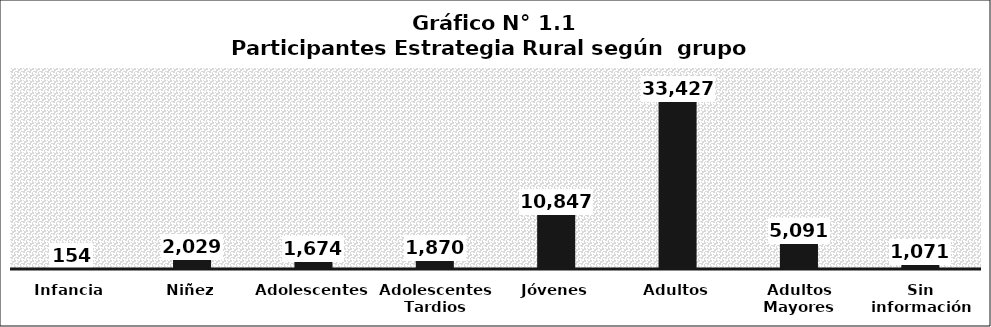
| Category | Series 0 |
|---|---|
| Infancia | 154 |
| Niñez | 2029 |
| Adolescentes | 1674 |
| Adolescentes Tardios | 1870 |
| Jóvenes | 10847 |
| Adultos | 33427 |
| Adultos Mayores | 5091 |
| Sin información | 1071 |